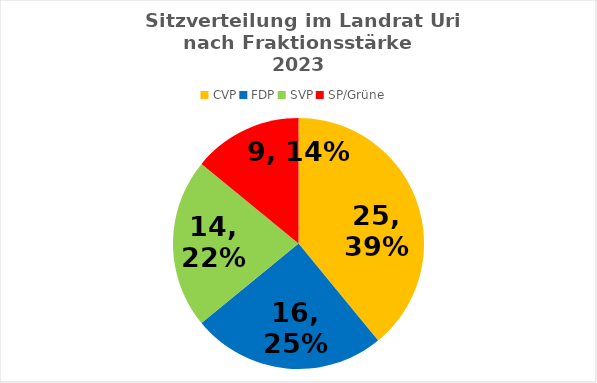
| Category | Series 0 |
|---|---|
| CVP | 25 |
| FDP | 16 |
| SVP | 14 |
| SP/Grüne | 9 |